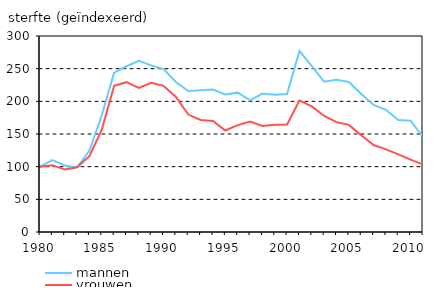
| Category | mannen | vrouwen |
|---|---|---|
| 1980.0 | 100 | 100 |
| 1981.0 | 110.02 | 102.298 |
| 1982.0 | 101.778 | 95.565 |
| 1983.0 | 98.856 | 99.018 |
| 1984.0 | 124.591 | 115.994 |
| 1985.0 | 178.696 | 156.678 |
| 1986.0 | 243.874 | 223.849 |
| 1987.0 | 253.66 | 229.312 |
| 1988.0 | 262.108 | 220.606 |
| 1989.0 | 254.976 | 228.51 |
| 1990.0 | 249.252 | 223.787 |
| 1991.0 | 229.642 | 206.597 |
| 1992.0 | 215.665 | 179.775 |
| 1993.0 | 216.946 | 171.584 |
| 1994.0 | 218.001 | 169.888 |
| 1995.0 | 210.431 | 155.313 |
| 1996.0 | 213.264 | 163.632 |
| 1997.0 | 201.37 | 169.139 |
| 1998.0 | 211.87 | 162.422 |
| 1999.0 | 210.086 | 164.325 |
| 2000.0 | 211.07 | 164.564 |
| 2001.0 | 277.257 | 201.081 |
| 2002.0 | 253.974 | 192.318 |
| 2003.0 | 229.945 | 177.558 |
| 2004.0 | 233.165 | 168.177 |
| 2005.0 | 229.704 | 163.954 |
| 2006.0 | 211.306 | 148.093 |
| 2007.0 | 194.459 | 133.111 |
| 2008.0 | 186.997 | 126.566 |
| 2009.0 | 171.521 | 118.763 |
| 2010.0 | 170.331 | 110.746 |
| 2011.0 | 145.139 | 103.072 |